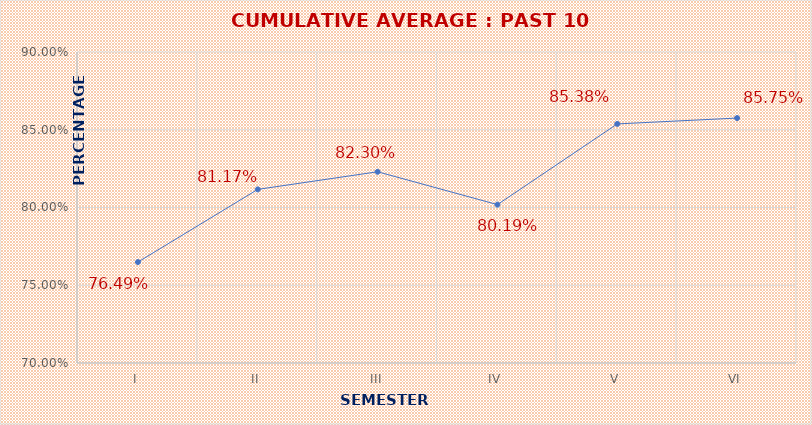
| Category | CUMULATIVE AVERAGE : PAST 10 YEARS |
|---|---|
| I | 0.765 |
| II | 0.812 |
| III | 0.823 |
| IV | 0.802 |
| V | 0.854 |
| VI | 0.858 |